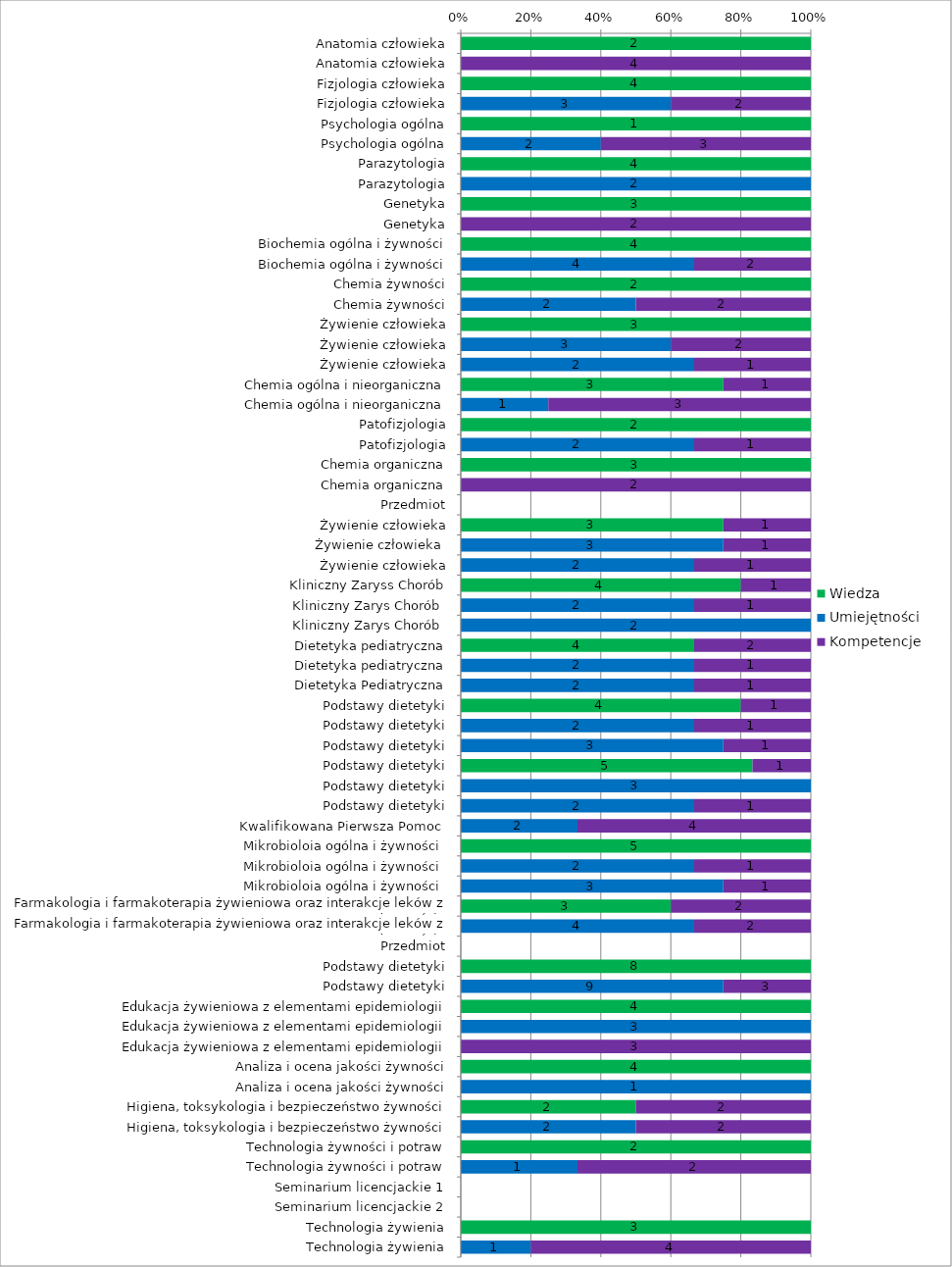
| Category | Wiedza | Umiejętności | Kompetencje |
|---|---|---|---|
| Anatomia człowieka | 2 | 0 | 0 |
| Anatomia człowieka | 0 | 0 | 4 |
| Fizjologia człowieka | 4 | 0 | 0 |
| Fizjologia człowieka | 0 | 3 | 2 |
| Psychologia ogólna | 1 | 0 | 0 |
| Psychologia ogólna | 0 | 2 | 3 |
| Parazytologia | 4 | 0 | 0 |
| Parazytologia | 0 | 2 | 0 |
| Genetyka | 3 | 0 | 0 |
| Genetyka | 0 | 0 | 2 |
| Biochemia ogólna i żywności | 4 | 0 | 0 |
| Biochemia ogólna i żywności | 0 | 4 | 2 |
| Chemia żywności | 2 | 0 | 0 |
| Chemia żywności | 0 | 2 | 2 |
| Żywienie człowieka | 3 | 0 | 0 |
| Żywienie człowieka | 0 | 3 | 2 |
| Żywienie człowieka | 0 | 2 | 1 |
| Chemia ogólna i nieorganiczna | 3 | 0 | 1 |
| Chemia ogólna i nieorganiczna | 0 | 1 | 3 |
| Patofizjologia | 2 | 0 | 0 |
| Patofizjologia | 0 | 2 | 1 |
| Chemia organiczna | 3 | 0 | 0 |
| Chemia organiczna | 0 | 0 | 2 |
| Przedmiot | 0 | 0 | 0 |
| Żywienie człowieka | 3 | 0 | 1 |
| Żywienie człowieka  | 0 | 3 | 1 |
| Żywienie człowieka | 0 | 2 | 1 |
| Kliniczny Zaryss Chorób | 4 | 0 | 1 |
| Kliniczny Zarys Chorób  | 0 | 2 | 1 |
| Kliniczny Zarys Chorób  | 0 | 2 | 0 |
| Dietetyka pediatryczna | 4 | 0 | 2 |
| Dietetyka pediatryczna | 0 | 2 | 1 |
| Dietetyka Pediatryczna | 0 | 2 | 1 |
| Podstawy dietetyki | 4 | 0 | 1 |
| Podstawy dietetyki | 0 | 2 | 1 |
| Podstawy dietetyki | 0 | 3 | 1 |
| Podstawy dietetyki | 5 | 0 | 1 |
| Podstawy dietetyki | 0 | 3 | 0 |
| Podstawy dietetyki | 0 | 2 | 1 |
| Kwalifikowana Pierwsza Pomoc  | 0 | 2 | 4 |
| Mikrobioloia ogólna i żywności  | 5 | 0 | 0 |
| Mikrobioloia ogólna i żywności  | 0 | 2 | 1 |
| Mikrobioloia ogólna i żywności  | 0 | 3 | 1 |
| Farmakologia i farmakoterapia żywieniowa oraz interakcje leków z żywnością  | 3 | 0 | 2 |
| Farmakologia i farmakoterapia żywieniowa oraz interakcje leków z żywnością  | 0 | 4 | 2 |
| Przedmiot | 0 | 0 | 0 |
| Podstawy dietetyki | 8 | 0 | 0 |
| Podstawy dietetyki | 0 | 9 | 3 |
| Edukacja żywieniowa z elementami epidemiologii | 4 | 0 | 0 |
| Edukacja żywieniowa z elementami epidemiologii | 0 | 3 | 0 |
| Edukacja żywieniowa z elementami epidemiologii | 0 | 0 | 3 |
| Analiza i ocena jakości żywności | 4 | 0 | 0 |
| Analiza i ocena jakości żywności | 0 | 1 | 0 |
| Higiena, toksykologia i bezpieczeństwo żywności | 2 | 0 | 2 |
| Higiena, toksykologia i bezpieczeństwo żywności | 0 | 2 | 2 |
| Technologia żywności i potraw | 2 | 0 | 0 |
| Technologia żywności i potraw | 0 | 1 | 2 |
| Seminarium licencjackie 1 | 0 | 0 | 0 |
| Seminarium licencjackie 2 | 0 | 0 | 0 |
| Technologia żywienia | 3 | 0 | 0 |
| Technologia żywienia | 0 | 1 | 4 |